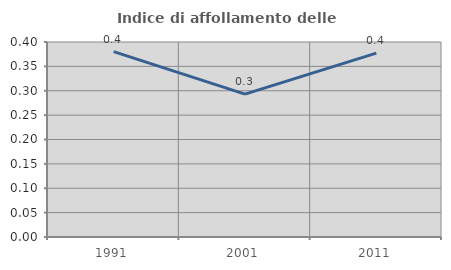
| Category | Indice di affollamento delle abitazioni  |
|---|---|
| 1991.0 | 0.38 |
| 2001.0 | 0.293 |
| 2011.0 | 0.377 |